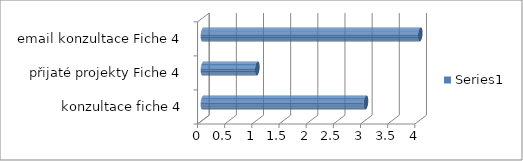
| Category | Series 0 |
|---|---|
| konzultace fiche 4 | 3 |
| přijaté projekty Fiche 4 | 1 |
| email konzultace Fiche 4 | 4 |